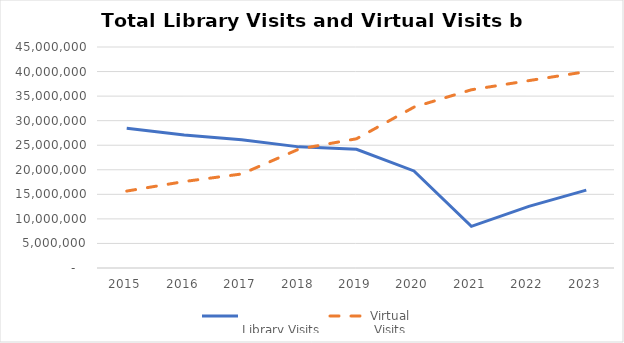
| Category | 
Library Visits | Virtual
 Visits |
|---|---|---|
| 2015.0 | 28446757 | 15665726 |
| 2016.0 | 27065546 | 17606806 |
| 2017.0 | 26134084 | 19142749 |
| 2018.0 | 24664303 | 24221825 |
| 2019.0 | 24163531 | 26312454 |
| 2020.0 | 19757541 | 32753377 |
| 2021.0 | 8488818 | 36290206 |
| 2022.0 | 12556881 | 38155442 |
| 2023.0 | 15867885 | 39985287 |